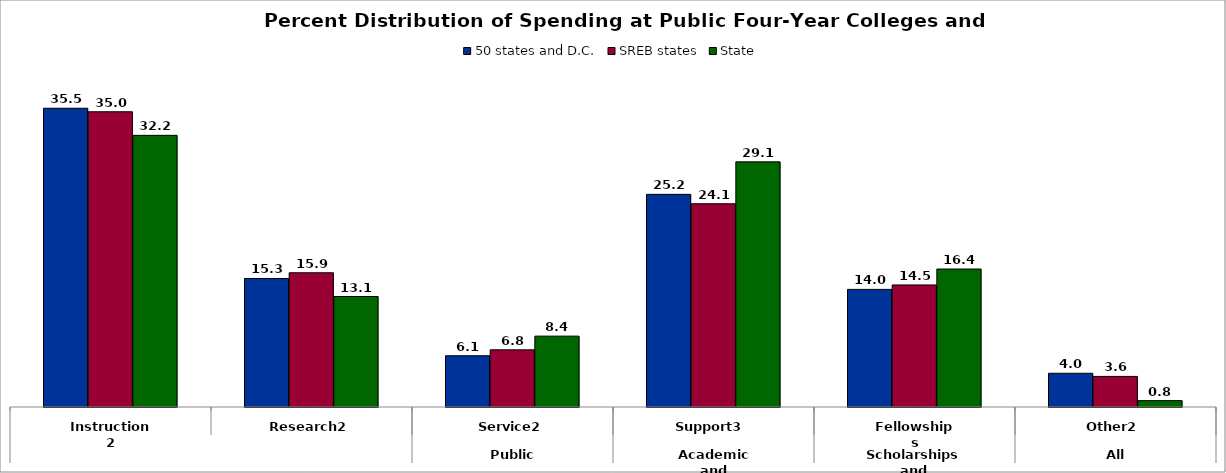
| Category | 50 states and D.C. | SREB states | State |
|---|---|---|---|
| 0 | 35.461 | 35.044 | 32.243 |
| 1 | 15.253 | 15.932 | 13.115 |
| 2 | 6.084 | 6.786 | 8.411 |
| 3 | 25.238 | 24.122 | 29.098 |
| 4 | 13.961 | 14.486 | 16.377 |
| 5 | 4.004 | 3.631 | 0.757 |